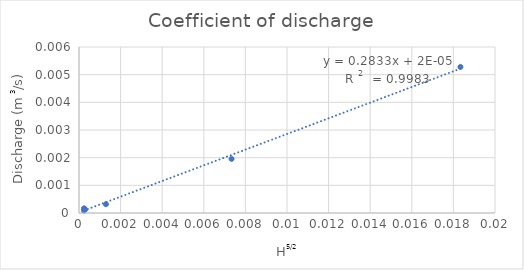
| Category | QA (m3/s) |
|---|---|
| 0.0003003734325801803 | 0 |
| 0.00024666854921622135 | 0 |
| 0.00024666854921622135 | 0 |
| 0.00024080779459056183 | 0 |
| 0.007333648478076928 | 0.002 |
| 0.0012964181424216497 | 0 |
| 0.018339117100667632 | 0.005 |